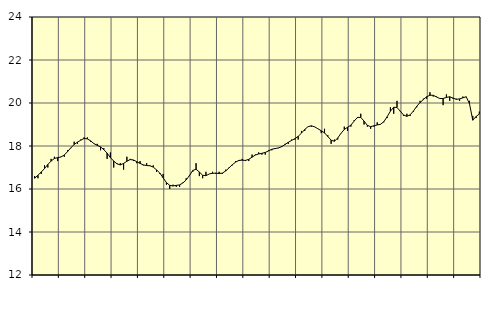
| Category | Piggar | Vård och omsorg, SNI 86-88 |
|---|---|---|
| nan | 16.6 | 16.5 |
| 87.0 | 16.5 | 16.64 |
| 87.0 | 16.7 | 16.79 |
| 87.0 | 17.1 | 16.95 |
| nan | 17 | 17.14 |
| 88.0 | 17.4 | 17.3 |
| 88.0 | 17.5 | 17.42 |
| 88.0 | 17.3 | 17.46 |
| nan | 17.5 | 17.49 |
| 89.0 | 17.5 | 17.58 |
| 89.0 | 17.8 | 17.74 |
| 89.0 | 17.9 | 17.92 |
| nan | 18.2 | 18.07 |
| 90.0 | 18.1 | 18.18 |
| 90.0 | 18.3 | 18.27 |
| 90.0 | 18.4 | 18.35 |
| nan | 18.4 | 18.33 |
| 91.0 | 18.2 | 18.24 |
| 91.0 | 18.1 | 18.11 |
| 91.0 | 18.1 | 18.03 |
| nan | 17.8 | 17.96 |
| 92.0 | 17.9 | 17.83 |
| 92.0 | 17.4 | 17.67 |
| 92.0 | 17.7 | 17.46 |
| nan | 17 | 17.3 |
| 93.0 | 17.2 | 17.17 |
| 93.0 | 17.2 | 17.12 |
| 93.0 | 16.9 | 17.19 |
| nan | 17.5 | 17.29 |
| 94.0 | 17.4 | 17.37 |
| 94.0 | 17.3 | 17.35 |
| 94.0 | 17.2 | 17.27 |
| nan | 17.3 | 17.19 |
| 95.0 | 17.1 | 17.12 |
| 95.0 | 17.2 | 17.09 |
| 95.0 | 17.1 | 17.08 |
| nan | 17.1 | 17.02 |
| 96.0 | 16.8 | 16.89 |
| 96.0 | 16.7 | 16.74 |
| 96.0 | 16.7 | 16.52 |
| nan | 16.2 | 16.3 |
| 97.0 | 16 | 16.17 |
| 97.0 | 16.2 | 16.14 |
| 97.0 | 16.1 | 16.17 |
| nan | 16.1 | 16.19 |
| 98.0 | 16.3 | 16.28 |
| 98.0 | 16.5 | 16.42 |
| 98.0 | 16.6 | 16.63 |
| nan | 16.8 | 16.86 |
| 99.0 | 17.2 | 16.92 |
| 99.0 | 16.6 | 16.79 |
| 99.0 | 16.5 | 16.64 |
| nan | 16.8 | 16.62 |
| 0.0 | 16.7 | 16.7 |
| 0.0 | 16.8 | 16.73 |
| 0.0 | 16.7 | 16.74 |
| nan | 16.8 | 16.72 |
| 1.0 | 16.7 | 16.74 |
| 1.0 | 16.9 | 16.84 |
| 1.0 | 17 | 16.98 |
| nan | 17.1 | 17.13 |
| 2.0 | 17.3 | 17.25 |
| 2.0 | 17.3 | 17.33 |
| 2.0 | 17.4 | 17.34 |
| nan | 17.3 | 17.33 |
| 3.0 | 17.3 | 17.38 |
| 3.0 | 17.6 | 17.48 |
| 3.0 | 17.6 | 17.58 |
| nan | 17.7 | 17.63 |
| 4.0 | 17.6 | 17.66 |
| 4.0 | 17.6 | 17.7 |
| 4.0 | 17.8 | 17.77 |
| nan | 17.8 | 17.85 |
| 5.0 | 17.9 | 17.88 |
| 5.0 | 17.9 | 17.91 |
| 5.0 | 18 | 17.97 |
| nan | 18.1 | 18.07 |
| 6.0 | 18.1 | 18.17 |
| 6.0 | 18.3 | 18.26 |
| 6.0 | 18.3 | 18.34 |
| nan | 18.3 | 18.45 |
| 7.0 | 18.7 | 18.6 |
| 7.0 | 18.7 | 18.77 |
| 7.0 | 18.9 | 18.9 |
| nan | 18.9 | 18.94 |
| 8.0 | 18.9 | 18.89 |
| 8.0 | 18.8 | 18.8 |
| 8.0 | 18.6 | 18.71 |
| nan | 18.8 | 18.61 |
| 9.0 | 18.5 | 18.44 |
| 9.0 | 18.1 | 18.27 |
| 9.0 | 18.3 | 18.22 |
| nan | 18.3 | 18.37 |
| 10.0 | 18.6 | 18.59 |
| 10.0 | 18.9 | 18.77 |
| 10.0 | 18.7 | 18.87 |
| nan | 18.9 | 18.97 |
| 11.0 | 19.2 | 19.16 |
| 11.0 | 19.3 | 19.33 |
| 11.0 | 19.5 | 19.33 |
| nan | 19 | 19.16 |
| 12.0 | 18.9 | 18.96 |
| 12.0 | 18.8 | 18.9 |
| 12.0 | 18.9 | 18.94 |
| nan | 19.1 | 18.98 |
| 13.0 | 19 | 19.01 |
| 13.0 | 19.1 | 19.13 |
| 13.0 | 19.3 | 19.36 |
| nan | 19.8 | 19.62 |
| 14.0 | 19.5 | 19.8 |
| 14.0 | 20.1 | 19.79 |
| 14.0 | 19.6 | 19.62 |
| nan | 19.4 | 19.44 |
| 15.0 | 19.5 | 19.38 |
| 15.0 | 19.4 | 19.45 |
| 15.0 | 19.6 | 19.63 |
| nan | 19.8 | 19.85 |
| 16.0 | 20.1 | 20.02 |
| 16.0 | 20.2 | 20.16 |
| 16.0 | 20.2 | 20.29 |
| nan | 20.5 | 20.36 |
| 17.0 | 20.3 | 20.36 |
| 17.0 | 20.3 | 20.28 |
| 17.0 | 20.2 | 20.21 |
| nan | 19.9 | 20.21 |
| 18.0 | 20.4 | 20.26 |
| 18.0 | 20.1 | 20.29 |
| 18.0 | 20.2 | 20.23 |
| nan | 20.2 | 20.17 |
| 19.0 | 20.1 | 20.19 |
| 19.0 | 20.3 | 20.24 |
| 19.0 | 20.3 | 20.29 |
| nan | 20.1 | 19.97 |
| 20.0 | 19.4 | 19.2 |
| 20.0 | 19.3 | 19.37 |
| 20.0 | 19.6 | 19.49 |